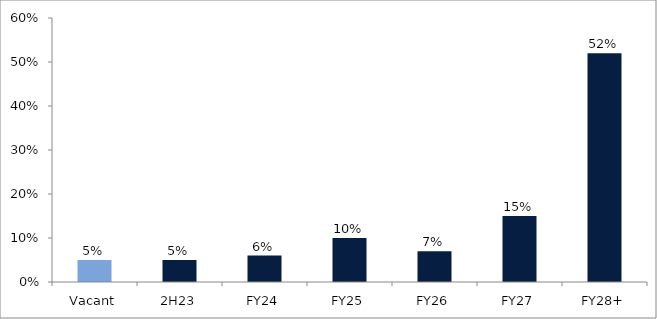
| Category | Series 0 |
|---|---|
| Vacant | 0.05 |
| 2H23 | 0.05 |
| FY24 | 0.06 |
| FY25 | 0.1 |
| FY26 | 0.07 |
| FY27 | 0.15 |
| FY28+ | 0.52 |